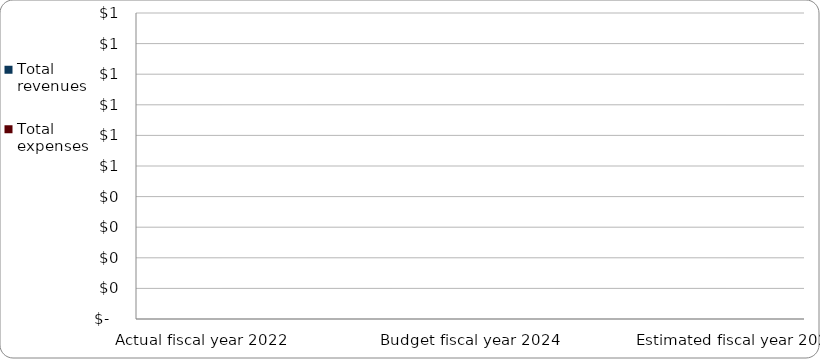
| Category | Series 1 | Total revenues | Total expenses |
|---|---|---|---|
| Actual fiscal year 2022 |  | 0 | 0 |
| Actual (estimated) fiscal year 2023 |  | 0 | 0 |
| Budget fiscal year 2024 |  | 0 | 0 |
| Estimated fiscal year 2025 |  | 0 | 0 |
| Estimated fiscal year 2026 |  | 0 | 0 |